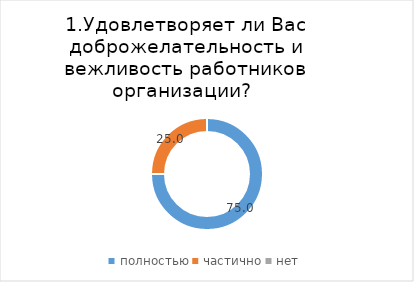
| Category | Кедровый |
|---|---|
| полностью | 75 |
| частично | 25 |
| нет | 0 |